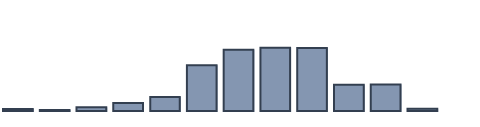
| Category | Series 0 |
|---|---|
| 0 | 0.632 |
| 1 | 0.344 |
| 2 | 1.144 |
| 3 | 2.557 |
| 4 | 4.432 |
| 5 | 14.457 |
| 6 | 19.286 |
| 7 | 19.939 |
| 8 | 19.854 |
| 9 | 8.252 |
| 10 | 8.386 |
| 11 | 0.718 |
| 12 | 0 |